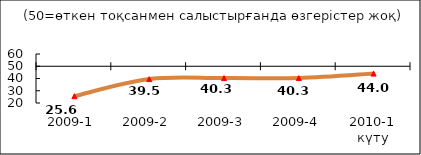
| Category | Диф.индекс ↓ |
|---|---|
| 2009-1 | 25.55 |
| 2009-2 | 39.51 |
| 2009-3 | 40.34 |
| 2009-4 | 40.345 |
| 2010-1 күту | 44.01 |